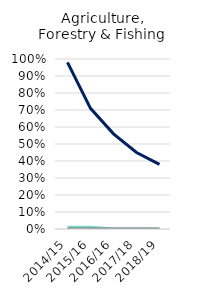
| Category | Employed | Self-Employed | Both |
|---|---|---|---|
| 2014/15 | 0.98 | 0.01 | 0 |
| 2015/16 | 0.71 | 0.01 | 0 |
| 2016/16 | 0.56 | 0 | 0 |
| 2017/18 | 0.45 | 0 | 0 |
| 2018/19 | 0.38 | 0 | 0 |